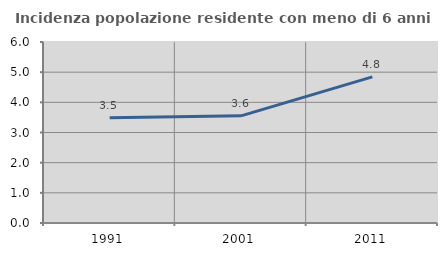
| Category | Incidenza popolazione residente con meno di 6 anni |
|---|---|
| 1991.0 | 3.492 |
| 2001.0 | 3.551 |
| 2011.0 | 4.844 |